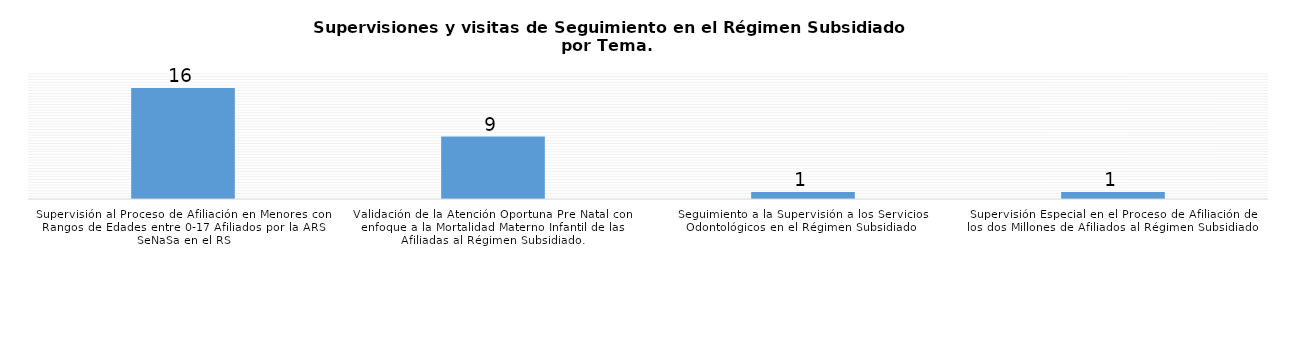
| Category | Enero-Junio |
|---|---|
| Supervisión al Proceso de Afiliación en Menores con Rangos de Edades entre 0-17 Afiliados por la ARS SeNaSa en el RS | 16 |
| Validación de la Atención Oportuna Pre Natal con enfoque a la Mortalidad Materno Infantil de las Afiliadas al Régimen Subsidiado. | 9 |
| Seguimiento a la Supervisión a los Servicios Odontológicos en el Régimen Subsidiado  | 1 |
| Supervisión Especial en el Proceso de Afiliación de los dos Millones de Afiliados al Régimen Subsidiado | 1 |